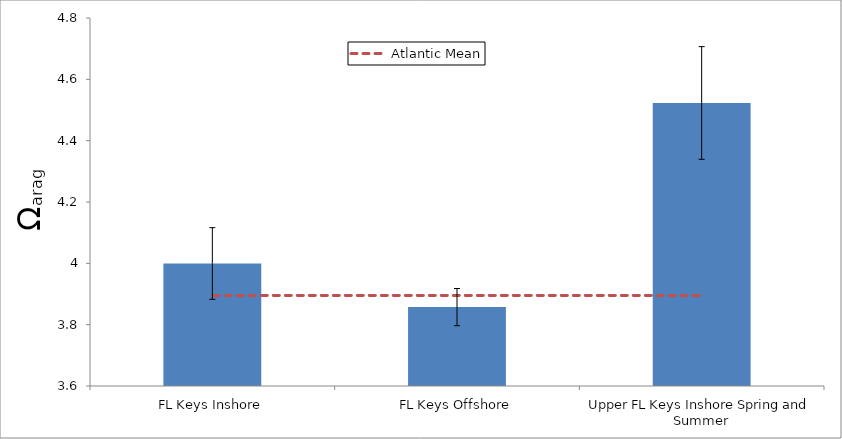
| Category | Series 0 |
|---|---|
| FL Keys Inshore | 3.999 |
| FL Keys Offshore | 3.857 |
| Upper FL Keys Inshore Spring and Summer | 4.523 |